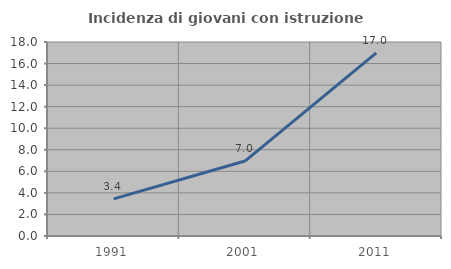
| Category | Incidenza di giovani con istruzione universitaria |
|---|---|
| 1991.0 | 3.448 |
| 2001.0 | 6.955 |
| 2011.0 | 16.987 |